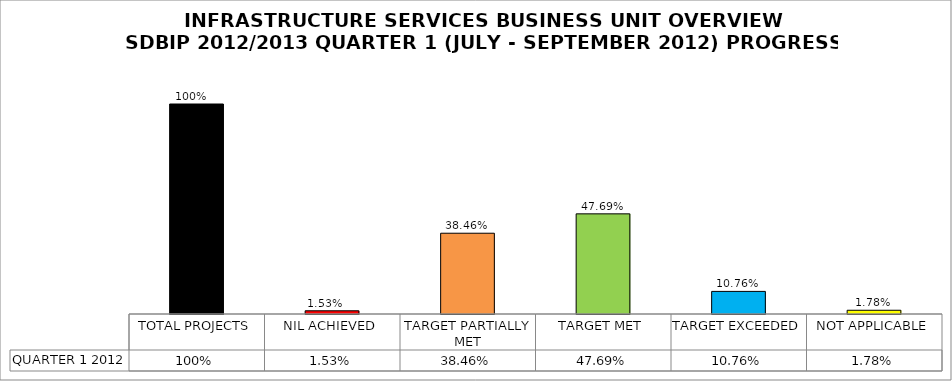
| Category | QUARTER 1 2012 |
|---|---|
| TOTAL PROJECTS | 1 |
| NIL ACHIEVED | 0.015 |
| TARGET PARTIALLY MET | 0.385 |
| TARGET MET | 0.477 |
| TARGET EXCEEDED | 0.108 |
| NOT APPLICABLE | 0.018 |